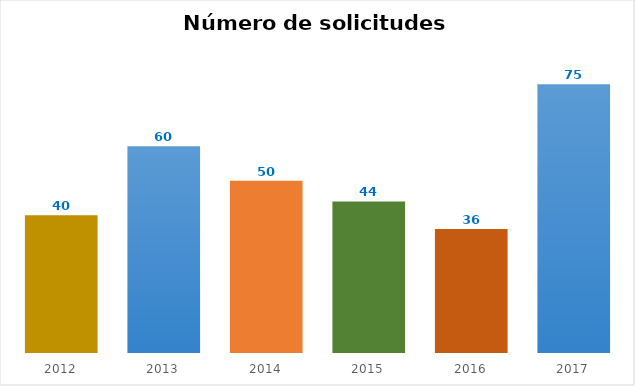
| Category | Series 0 |
|---|---|
| 2012.0 | 40 |
| 2013.0 | 60 |
| 2014.0 | 50 |
| 2015.0 | 44 |
| 2016.0 | 36 |
| 2017.0 | 78 |